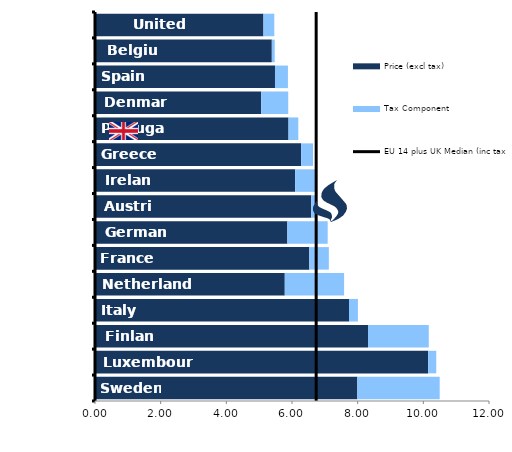
| Category | Price (excl tax) | Tax Component |
|---|---|---|
| Sweden | 7.99 | 2.508 |
| Luxembourg | 10.148 | 0.246 |
| Finland | 8.315 | 1.851 |
| Italy | 7.736 | 0.272 |
| Netherlands | 5.78 | 1.807 |
| France | 6.526 | 0.596 |
| Germany | 5.859 | 1.228 |
| Austria | 6.587 | 0.149 |
| Ireland | 6.096 | 0.614 |
| Greece | 6.28 | 0.36 |
| Portugal | 5.894 | 0.298 |
| Denmark | 5.061 | 0.824 |
| Spain | 5.482 | 0.395 |
| Belgium | 5.385 | 0.088 |
| United Kingdom | 5.131 | 0.33 |